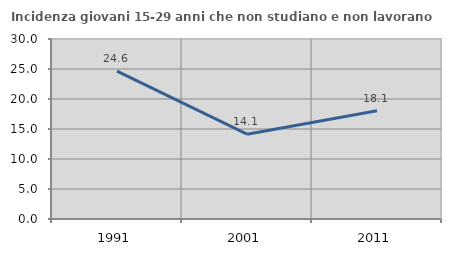
| Category | Incidenza giovani 15-29 anni che non studiano e non lavorano  |
|---|---|
| 1991.0 | 24.648 |
| 2001.0 | 14.137 |
| 2011.0 | 18.054 |